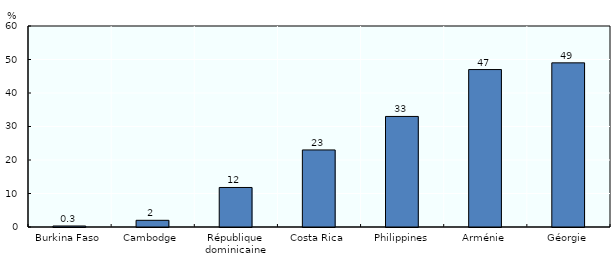
| Category | Series 0 |
|---|---|
| Burkina Faso | 0.3 |
| Cambodge | 2 |
| République dominicaine | 11.8 |
| Costa Rica | 23 |
| Philippines | 33 |
| Arménie | 47 |
| Géorgie | 49 |